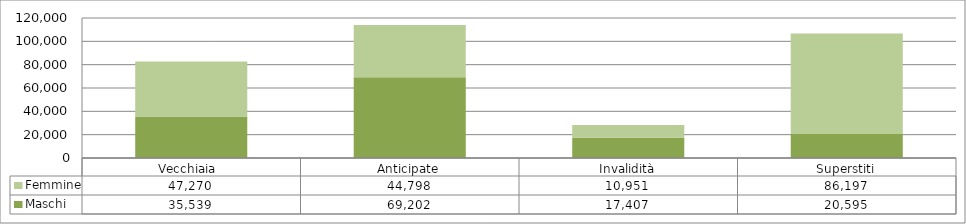
| Category | Maschi | Femmine |
|---|---|---|
| Vecchiaia  | 35539 | 47270 |
| Anticipate | 69202 | 44798 |
| Invalidità | 17407 | 10951 |
| Superstiti | 20595 | 86197 |